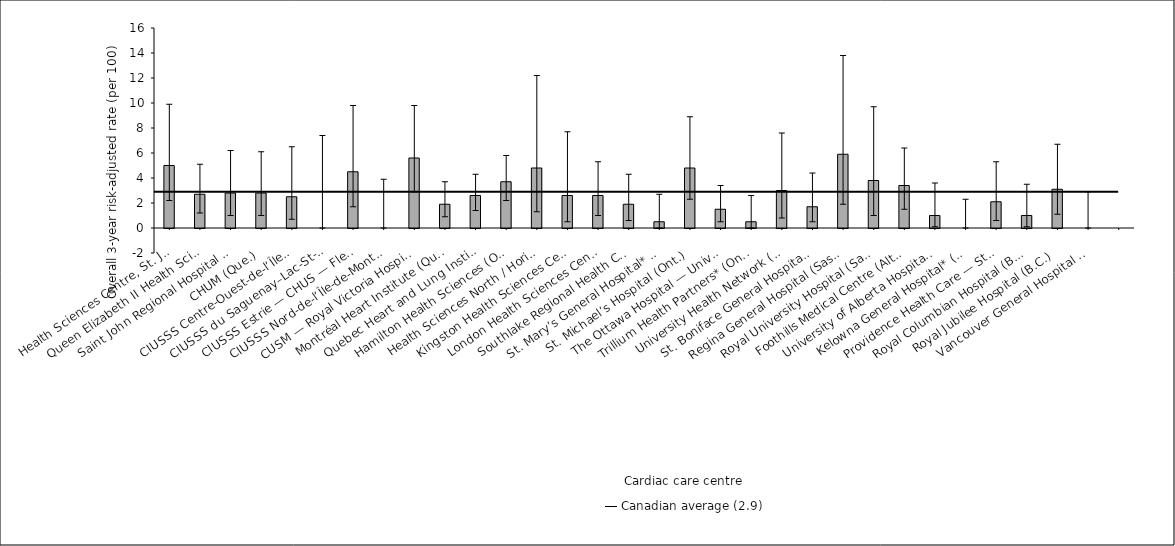
| Category | Risk-adjusted rate |
|---|---|
| Health Sciences Centre, St. John’s (N.L.) | 5 |
| Queen Elizabeth II Health Sciences Centre (N.S.) | 2.7 |
| Saint John Regional Hospital (N.B.) | 2.8 |
| CHUM (Que.) | 2.8 |
| CIUSSS Centre-Ouest-de-l’Île-de-Montréal — Jewish General Hospital (Que.) | 2.5 |
| CIUSSS du Saguenay–Lac-St-Jean — Chicoutimi Hospital (Que.) | 0 |
| CIUSSS Estrie — CHUS — Fleurimont Hospital (Que.) | 4.5 |
| CIUSSS Nord-de-l’Île-de-Montréal — Montréal Sacré-Coeur Hospital (Que.) | 0 |
| CUSM — Royal Victoria Hospital (Que.) | 5.6 |
| Montréal Heart Institute (Que.) | 1.9 |
| Quebec Heart and Lung Institute (Que.) | 2.6 |
| Hamilton Health Sciences (Ont.) | 3.7 |
| Health Sciences North / Horizon Santé-Nord (Ont.) | 4.8 |
| Kingston Health Sciences Centre (Ont.) | 2.6 |
| London Health Sciences Centre (Ont.) | 2.6 |
| Southlake Regional Health Centre (Ont.) | 1.9 |
| St. Mary’s General Hospital* (Ont.) | 0.5 |
| St. Michael’s Hospital (Ont.) | 4.8 |
| The Ottawa Hospital — University of Ottawa Heart Institute (Ont.) | 1.5 |
| Trillium Health Partners* (Ont.) | 0.5 |
| University Health Network (Ont.) | 3 |
| St. Boniface General Hospital (Man.) | 1.7 |
| Regina General Hospital (Sask.) | 5.9 |
| Royal University Hospital (Sask.) | 3.8 |
| Foothills Medical Centre (Alta.) | 3.4 |
| University of Alberta Hospital (Alta.) | 1 |
| Kelowna General Hospital* (B.C.) | 0 |
| Providence Health Care — St. Paul’s Hospital (Vancouver) (B.C.) | 2.1 |
| Royal Columbian Hospital (B.C.) | 1 |
| Royal Jubilee Hospital (B.C.) | 3.1 |
| Vancouver General Hospital (B.C.) | 0 |